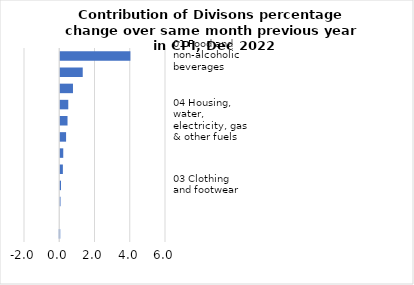
| Category |     Contributions |
|---|---|
| 01 Food and non-alcoholic beverages | 3.981 |
| 07 Transport | 1.276 |
| 08 Communication | 0.722 |
| 11 Restaurants and hotels | 0.455 |
| 04 Housing, water, electricity, gas & other fuels | 0.413 |
| 12 Miscellaneous goods & services | 0.331 |
| 05 Furnishings, household equipment & maintenance | 0.17 |
| 02 Alcoholic beverages, tobacco & narcotics | 0.149 |
| 03 Clothing and footwear | 0.043 |
| 09 Recreation and culture | 0.015 |
| 10 Education | 0 |
| 06 Health | -0.028 |